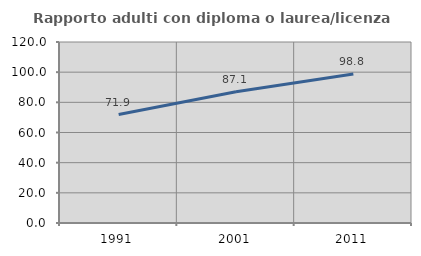
| Category | Rapporto adulti con diploma o laurea/licenza media  |
|---|---|
| 1991.0 | 71.875 |
| 2001.0 | 87.054 |
| 2011.0 | 98.814 |